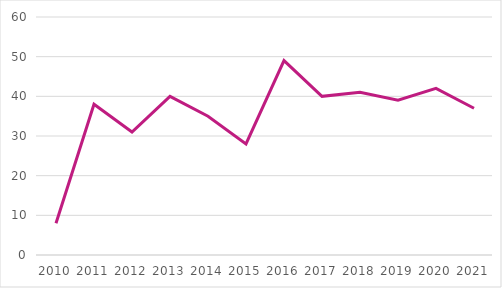
| Category | Antal udstedte patenter (universiteterne)  |
|---|---|
| 2010.0 | 8 |
| 2011.0 | 38 |
| 2012.0 | 31 |
| 2013.0 | 40 |
| 2014.0 | 35 |
| 2015.0 | 28 |
| 2016.0 | 49 |
| 2017.0 | 40 |
| 2018.0 | 41 |
| 2019.0 | 39 |
| 2020.0 | 42 |
| 2021.0 | 37 |